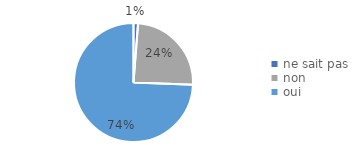
| Category | % |
|---|---|
| ne sait pas | 0.012 |
| non | 0.244 |
| oui | 0.744 |